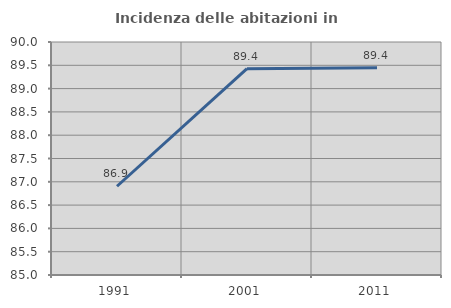
| Category | Incidenza delle abitazioni in proprietà  |
|---|---|
| 1991.0 | 86.905 |
| 2001.0 | 89.428 |
| 2011.0 | 89.45 |